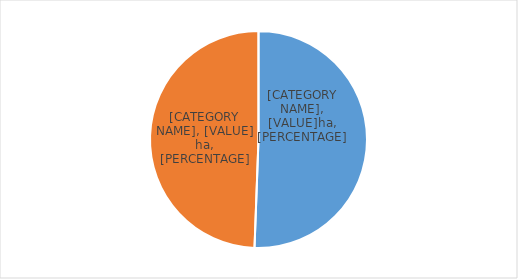
| Category | Series 0 |
|---|---|
| Forest logging concession (expired by 2050) | 8600000 |
| Future forest development  | 8400000 |